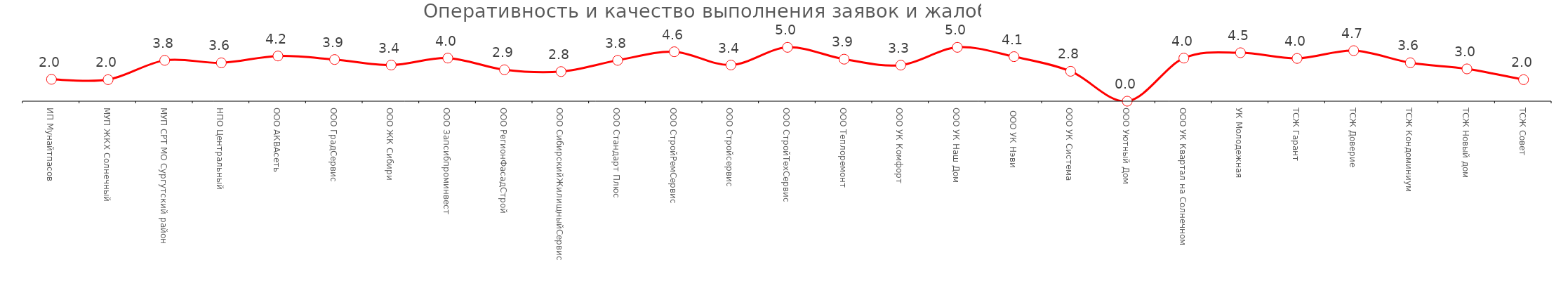
| Category |  Оперативность и качество выполнения заявок и жалоб |
|---|---|
| ИП Мунайтпасов | 2.032 |
| МУП ЖКХ Солнечный | 2 |
| МУП СРТ МО Сургутский район | 3.791 |
| НПО Центральный | 3.562 |
| ООО АКВАсеть | 4.194 |
| ООО ГрадСервис | 3.868 |
| ООО ЖК Сибири | 3.353 |
| ООО Запсибпроминвест | 4 |
| ООО РегионФасадСтрой | 2.917 |
| ООО СибирскийЖилищныйСервис | 2.75 |
| ООО Стандарт Плюс | 3.792 |
| ООО СтройРемСервис | 4.589 |
| ООО Стройсервис | 3.357 |
| ООО СтройТехСервис | 5 |
| ООО Теплоремонт | 3.9 |
| ООО УК Комфорт | 3.346 |
| ООО УК Наш Дом | 5 |
|  ООО УК Нэви | 4.135 |
| ООО УК Система | 2.778 |
| ООО Уютный Дом | 0 |
| ООО УК Квартал на Солнечном | 4 |
| УК Молодежная | 4.5 |
| ТСЖ Гарант | 3.969 |
| ТСЖ Доверие | 4.692 |
| ТСЖ Кондоминиум | 3.568 |
| ТСЖ Новый дом | 3 |
| ТСЖ Совет | 2 |